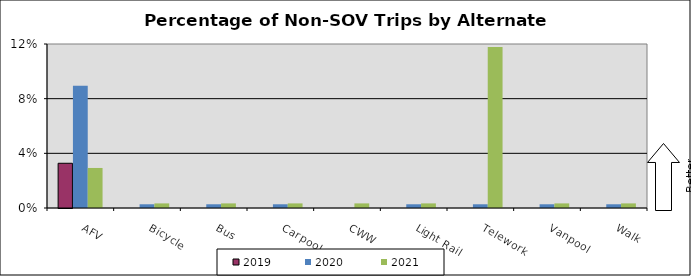
| Category | 2019 | 2020 | 2021 |
|---|---|---|---|
| AFV | 0.033 | 0.089 | 0.029 |
| Bicycle | 0 | 0.003 | 0.003 |
| Bus | 0 | 0.003 | 0.003 |
| Carpool | 0 | 0.003 | 0.003 |
| CWW | 0 | 0 | 0.003 |
| Light Rail | 0 | 0.003 | 0.003 |
| Telework | 0 | 0.003 | 0.118 |
| Vanpool | 0 | 0.003 | 0.003 |
| Walk | 0 | 0.003 | 0.003 |